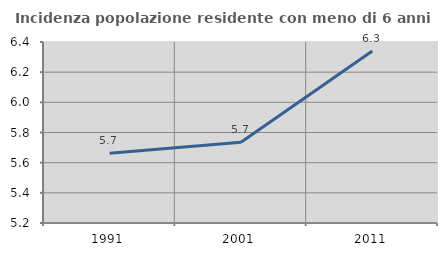
| Category | Incidenza popolazione residente con meno di 6 anni |
|---|---|
| 1991.0 | 5.663 |
| 2001.0 | 5.736 |
| 2011.0 | 6.34 |